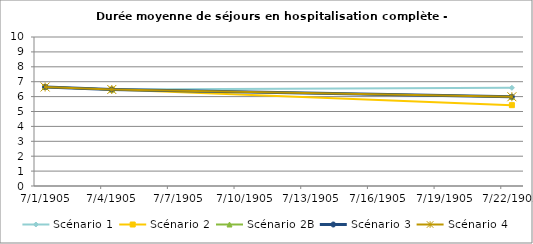
| Category | Scénario 1 | Scénario 2 | Scénario 2B | Scénario 3 | Scénario 4 |
|---|---|---|---|---|---|
| 2009.0 | 6.645 | 6.645 | 6.645 | 6.645 | 6.645 |
| 2012.0 | 6.477 | 6.477 | 6.477 | 6.477 | 6.477 |
| 2030.0 | 6.589 | 5.426 | 5.991 | 5.991 | 5.991 |